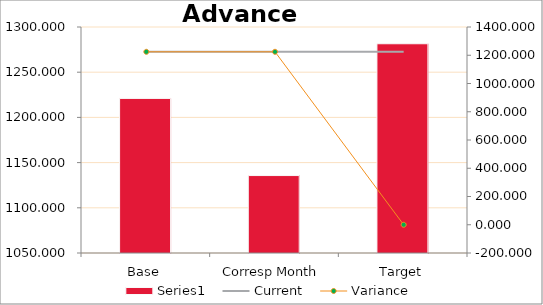
| Category | Series 0 |
|---|---|
| Base | 1220.997 |
| Corresp Month | 1135.671 |
| Target | 1281.457 |